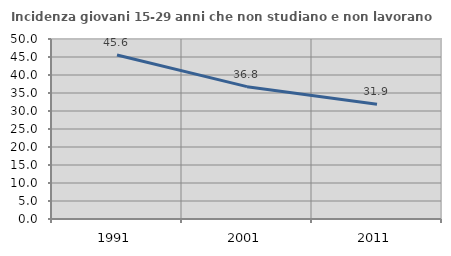
| Category | Incidenza giovani 15-29 anni che non studiano e non lavorano  |
|---|---|
| 1991.0 | 45.573 |
| 2001.0 | 36.763 |
| 2011.0 | 31.866 |